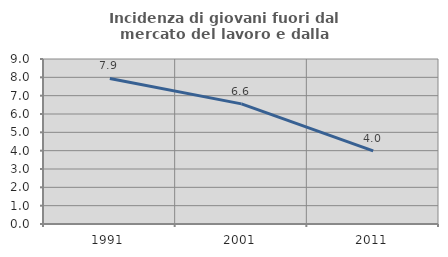
| Category | Incidenza di giovani fuori dal mercato del lavoro e dalla formazione  |
|---|---|
| 1991.0 | 7.94 |
| 2001.0 | 6.553 |
| 2011.0 | 3.986 |